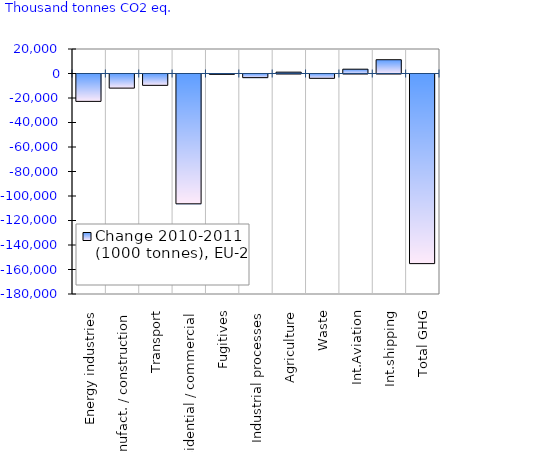
| Category | Change 2010-2011 (1000 tonnes), EU-27 |
|---|---|
| Energy industries | -22354.026 |
| Manufact. / construction | -11524.624 |
| Transport | -9269.199 |
| Residential / commercial | -105959.189 |
| Fugitives | -281.028 |
| Industrial processes | -2963.984 |
| Agriculture | 1102.895 |
| Waste | -3544.653 |
| Int.Aviation | 3515.941 |
| Int.shipping | 11257.823 |
| Total GHG | -154793.807 |